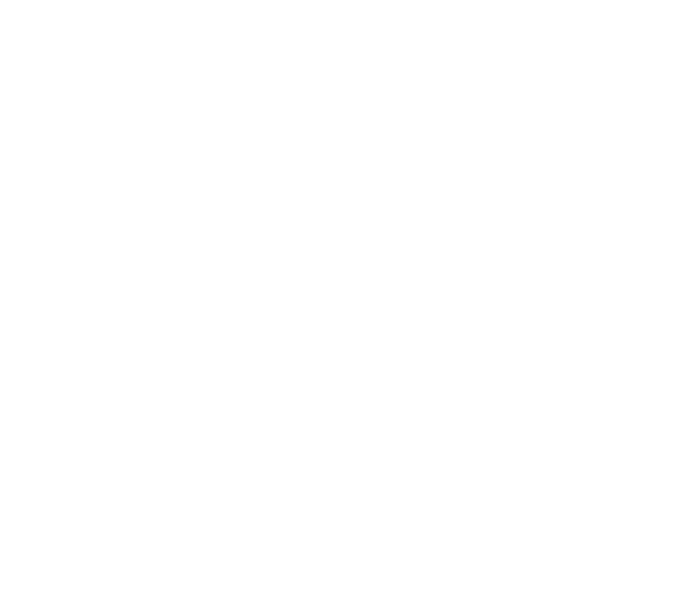
| Category | Series 0 |
|---|---|
| Incontinence wear & nappies | 0 |
| Tissue paper  | 0 |
| Food waste  | 0 |
| Recyclable plastics | 0 |
| Plastic film | 0 |
| Clinical non-risk  | 0 |
| Clinical risk | 0 |
| Plastic gloves | 0 |
| Recyclable paper | 0 |
| Composite packaging | 0 |
| Cardboard | 0 |
| Packaged food waste | 0 |
| Covers (composite) | 0 |
| Unrecoverable packaging | 0 |
| Cleaning cloths | 0 |
| Plastic aprons | 0 |
| Liquid waste | 0 |
| IV bags (empty) | 0 |
| Recyclable metal | 0 |
| Gowns (composite) | 0 |
| Unused materials | 0 |
| Garden waste | 0 |
| Tetra Pakpackaging | 0 |
| IV & urine bags (with liquid) | 0 |
| Composite cups | 0 |
| Other metal waste | 0 |
| Lab samples / bodily fluids | 0 |
| Glass | 0 |
| Medicines | 0 |
| CSSD wrapping | 0 |
| Ink cartridges | 0 |
| OTHER MATERIALS | 0 |